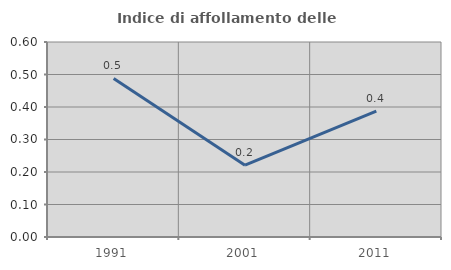
| Category | Indice di affollamento delle abitazioni  |
|---|---|
| 1991.0 | 0.488 |
| 2001.0 | 0.221 |
| 2011.0 | 0.388 |